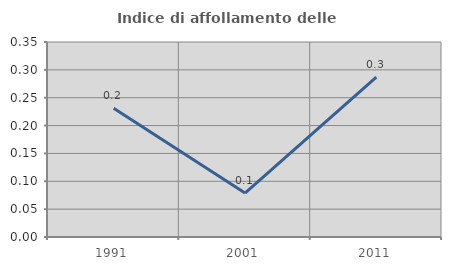
| Category | Indice di affollamento delle abitazioni  |
|---|---|
| 1991.0 | 0.231 |
| 2001.0 | 0.079 |
| 2011.0 | 0.287 |